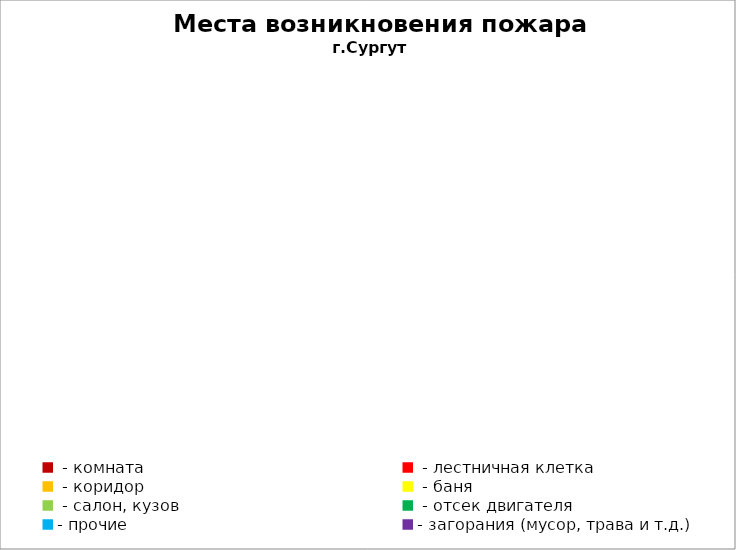
| Category | Места возникновения пожара |
|---|---|
|  - комната | 29 |
|  - лестничная клетка | 3 |
|  - коридор | 7 |
|  - баня | 7 |
|  - салон, кузов | 14 |
|  - отсек двигателя | 26 |
| - прочие | 87 |
| - загорания (мусор, трава и т.д.)  | 81 |